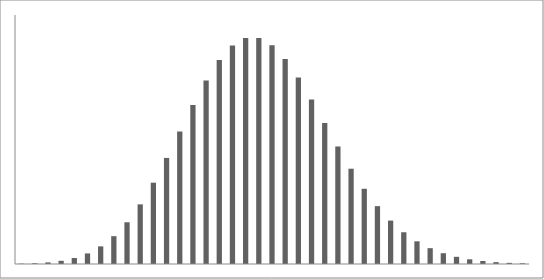
| Category | Series 0 |
|---|---|
| 12.0 | 0 |
| 13.0 | 0 |
| 14.0 | 0.001 |
| 15.0 | 0.001 |
| 16.0 | 0.002 |
| 17.0 | 0.003 |
| 18.0 | 0.006 |
| 19.0 | 0.009 |
| 20.0 | 0.013 |
| 21.0 | 0.019 |
| 22.0 | 0.026 |
| 23.0 | 0.034 |
| 24.0 | 0.043 |
| 25.0 | 0.051 |
| 26.0 | 0.059 |
| 27.0 | 0.066 |
| 28.0 | 0.07 |
| 29.0 | 0.073 |
| 30.0 | 0.073 |
| 31.0 | 0.07 |
| 32.0 | 0.066 |
| 33.0 | 0.06 |
| 34.0 | 0.053 |
| 35.0 | 0.045 |
| 36.0 | 0.038 |
| 37.0 | 0.031 |
| 38.0 | 0.024 |
| 39.0 | 0.019 |
| 40.0 | 0.014 |
| 41.0 | 0.01 |
| 42.0 | 0.007 |
| 43.0 | 0.005 |
| 44.0 | 0.003 |
| 45.0 | 0.002 |
| 46.0 | 0.002 |
| 47.0 | 0.001 |
| 48.0 | 0.001 |
| 49.0 | 0 |
| 50.0 | 0 |